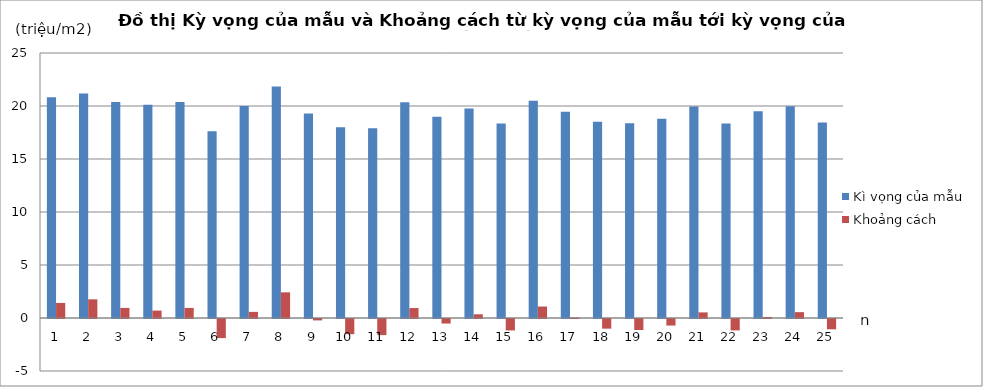
| Category | Kì vọng của mẫu | Khoảng cách |
|---|---|---|
| 0 | 20.837 | 1.421 |
| 1 | 21.178 | 1.762 |
| 2 | 20.37 | 0.954 |
| 3 | 20.118 | 0.702 |
| 4 | 20.367 | 0.951 |
| 5 | 17.615 | -1.801 |
| 6 | 19.994 | 0.578 |
| 7 | 21.838 | 2.422 |
| 8 | 19.283 | -0.134 |
| 9 | 17.984 | -1.432 |
| 10 | 17.9 | -1.516 |
| 11 | 20.354 | 0.938 |
| 12 | 18.987 | -0.429 |
| 13 | 19.766 | 0.35 |
| 14 | 18.338 | -1.078 |
| 15 | 20.499 | 1.083 |
| 16 | 19.462 | 0.046 |
| 17 | 18.506 | -0.911 |
| 18 | 18.377 | -1.04 |
| 19 | 18.797 | -0.619 |
| 20 | 19.945 | 0.528 |
| 21 | 18.34 | -1.076 |
| 22 | 19.515 | 0.099 |
| 23 | 19.968 | 0.552 |
| 24 | 18.445 | -0.972 |